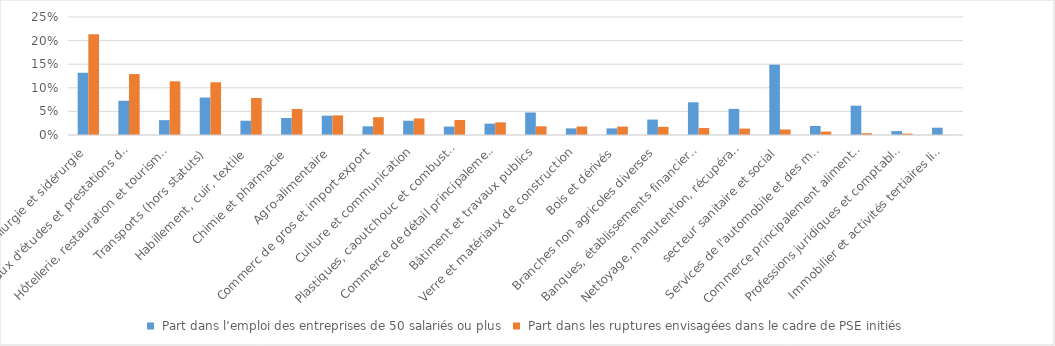
| Category |  Part dans l’emploi des entreprises de 50 salariés ou plus |  Part dans les ruptures envisagées dans le cadre de PSE initiés |
|---|---|---|
| Métallurgie et sidérurgie | 0.132 | 0.214 |
| Bureaux d'études et prestations de services aux entreprises  | 0.072 | 0.129 |
| Hôtellerie, restauration et tourisme  | 0.031 | 0.114 |
| Transports (hors statuts)  | 0.079 | 0.112 |
| Habillement, cuir, textile  | 0.03 | 0.078 |
| Chimie et pharmacie  | 0.036 | 0.055 |
| Agro-alimentaire | 0.041 | 0.042 |
| Commerc de gros et import-export | 0.018 | 0.038 |
| Culture et communication | 0.03 | 0.035 |
| Plastiques, caoutchouc et combustibles | 0.018 | 0.032 |
| Commerce de détail principalement non alimentaire | 0.024 | 0.027 |
| Bâtiment et travaux publics | 0.048 | 0.018 |
| Verre et matériaux de construction | 0.014 | 0.018 |
| Bois et dérivés | 0.014 | 0.018 |
| Branches non agricoles diverses | 0.033 | 0.017 |
| Banques, établissements financiers et assurances | 0.069 | 0.015 |
| Nettoyage, manutention, récupération et sécurité | 0.055 | 0.014 |
| secteur sanitaire et social | 0.149 | 0.012 |
| Services de l'automobile et des matériels roulants | 0.019 | 0.007 |
| Commerce principalement alimentaire | 0.062 | 0.004 |
| Professions juridiques et comptables  | 0.008 | 0.003 |
| Immobilier et activités tertiaires liées au bâtiment | 0.015 | 0 |